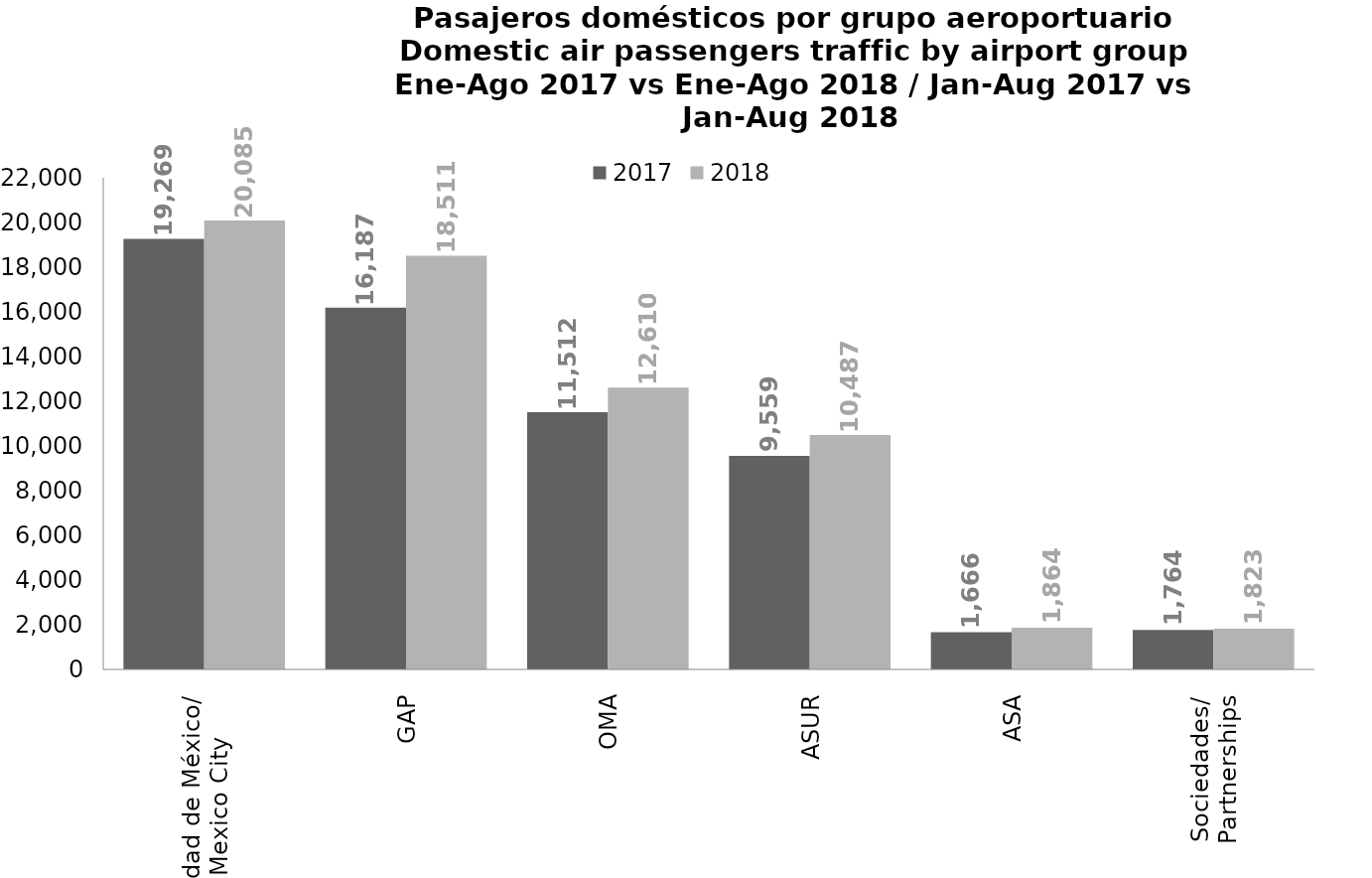
| Category | 2017 | 2018 |
|---|---|---|
| Ciudad de México/
Mexico City | 19268.687 | 20085.392 |
| GAP | 16186.547 | 18511.491 |
| OMA | 11511.695 | 12609.685 |
| ASUR | 9558.771 | 10487.408 |
| ASA | 1666.321 | 1863.564 |
| Sociedades/
Partnerships | 1764.226 | 1823.427 |